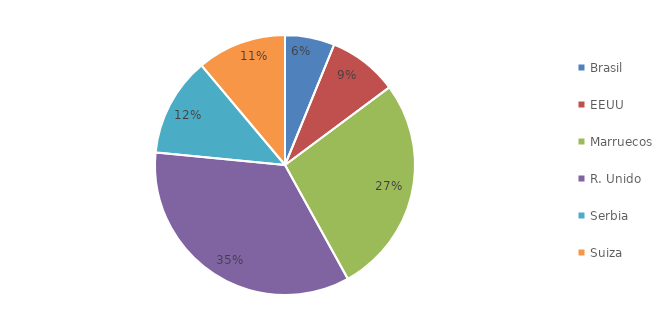
| Category | Series 0 |
|---|---|
| Brasil | 5 |
| EEUU | 7 |
| Marruecos | 22 |
| R. Unido | 28 |
| Serbia | 10 |
| Suiza | 9 |